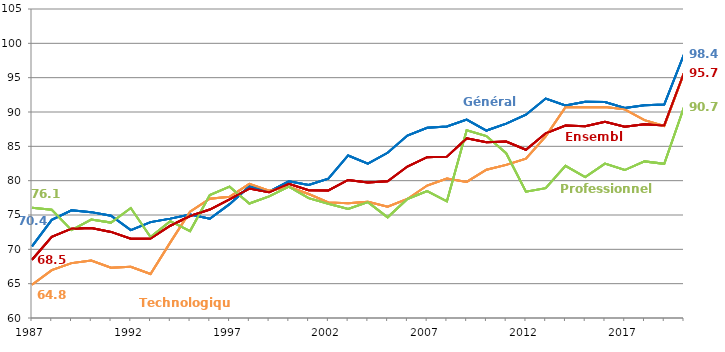
| Category | Générale | Technologique | Professionnelle | Ensemble |
|---|---|---|---|---|
| 1987 | 70.433 | 64.844 | 76.059 | 68.48 |
| 1988 | 74.298 | 66.976 | 75.76 | 71.83 |
| 1989 | 75.686 | 67.993 | 72.804 | 73.015 |
| 1990 | 75.417 | 68.361 | 74.338 | 73.116 |
| 1991 | 74.883 | 67.313 | 73.894 | 72.535 |
| 1992 | 72.793 | 67.472 | 76.012 | 71.558 |
| 1993 | 73.962 | 66.419 | 71.798 | 71.567 |
| 1994 | 74.472 | 71.015 | 74.102 | 73.436 |
| 1995 | 75.082 | 75.492 | 72.657 | 74.856 |
| 1996 | 74.45 | 77.383 | 77.895 | 75.798 |
| 1997 | 76.578 | 77.654 | 79.127 | 77.277 |
| 1998 | 79.164 | 79.529 | 76.669 | 78.851 |
| 1999 | 78.39 | 78.542 | 77.705 | 78.314 |
| 2000 | 79.897 | 79.116 | 79.147 | 79.53 |
| 2001 | 79.369 | 78.056 | 77.454 | 78.617 |
| 2002 | 80.297 | 76.838 | 76.645 | 78.57 |
| 2003 | 83.669 | 76.703 | 75.876 | 80.104 |
| 2004 | 82.477 | 76.92 | 76.873 | 79.725 |
| 2005 | 84.065 | 76.211 | 74.657 | 79.921 |
| 2006 | 86.566 | 77.333 | 77.333 | 82.056 |
| 2007 | 87.704 | 79.291 | 78.487 | 83.419 |
| 2008 | 87.9 | 80.3 | 77 | 83.5 |
| 2009 | 88.898 | 79.81 | 87.33 | 86.156 |
| 2010 | 87.3 | 81.6 | 86.5 | 85.6 |
| 2011 | 88.3 | 82.3 | 84 | 85.7 |
| 2012 | 89.6 | 83.2 | 78.4 | 84.5 |
| 2013 | 91.964 | 86.452 | 78.908 | 86.906 |
| 2014 | 90.953 | 90.702 | 82.162 | 88.031 |
| 2015 | 91.477 | 90.699 | 80.522 | 87.91 |
| 2016 | 91.452 | 90.724 | 82.48 | 88.575 |
| 2017 | 90.592 | 90.385 | 81.546 | 87.863 |
| 2018 | 90.979 | 88.808 | 82.806 | 88.233 |
| 2019 | 91.084 | 87.969 | 82.45 | 88.043 |
| 2020p | 98.4 | 95.7 | 90.7 | 95.7 |